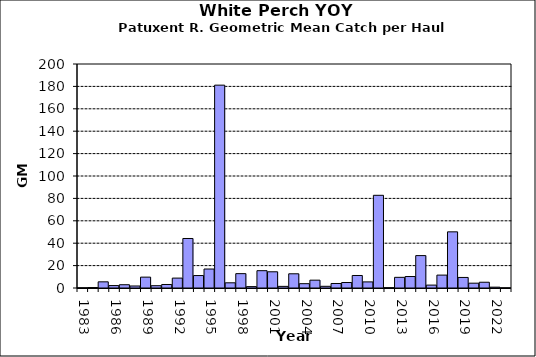
| Category | Series 0 |
|---|---|
| 1983.0 | 0.105 |
| 1984.0 | 0.409 |
| 1985.0 | 5.509 |
| 1986.0 | 2.164 |
| 1987.0 | 2.925 |
| 1988.0 | 1.793 |
| 1989.0 | 9.701 |
| 1990.0 | 2.063 |
| 1991.0 | 3.131 |
| 1992.0 | 8.844 |
| 1993.0 | 44.209 |
| 1994.0 | 11.111 |
| 1995.0 | 16.941 |
| 1996.0 | 181.111 |
| 1997.0 | 4.635 |
| 1998.0 | 12.817 |
| 1999.0 | 1.231 |
| 2000.0 | 15.471 |
| 2001.0 | 14.477 |
| 2002.0 | 1.454 |
| 2003.0 | 12.684 |
| 2004.0 | 3.86 |
| 2005.0 | 6.999 |
| 2006.0 | 1.512 |
| 2007.0 | 4.022 |
| 2008.0 | 4.9 |
| 2009.0 | 11.168 |
| 2010.0 | 5.45 |
| 2011.0 | 82.759 |
| 2012.0 | 0.22 |
| 2013.0 | 9.522 |
| 2014.0 | 10.246 |
| 2015.0 | 28.934 |
| 2016.0 | 2.59 |
| 2017.0 | 11.517 |
| 2018.0 | 50.15 |
| 2019.0 | 9.42 |
| 2020.0 | 4.3 |
| 2021.0 | 5.145 |
| 2022.0 | 0.747 |
| 2023.0 | 0.039 |